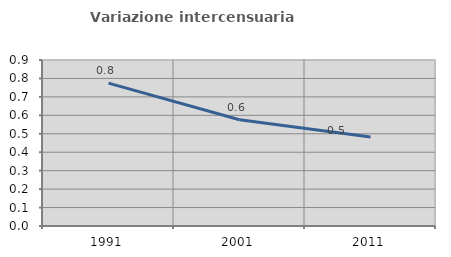
| Category | Variazione intercensuaria annua |
|---|---|
| 1991.0 | 0.775 |
| 2001.0 | 0.576 |
| 2011.0 | 0.482 |